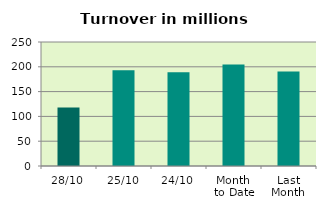
| Category | Series 0 |
|---|---|
| 28/10 | 118.17 |
| 25/10 | 193.03 |
| 24/10 | 188.927 |
| Month 
to Date | 204.441 |
| Last
Month | 190.73 |